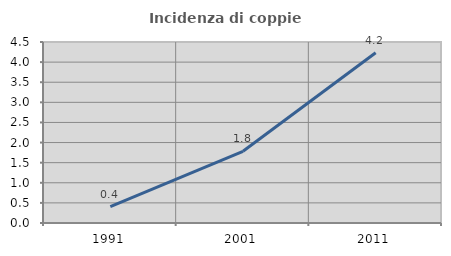
| Category | Incidenza di coppie miste |
|---|---|
| 1991.0 | 0.41 |
| 2001.0 | 1.783 |
| 2011.0 | 4.234 |